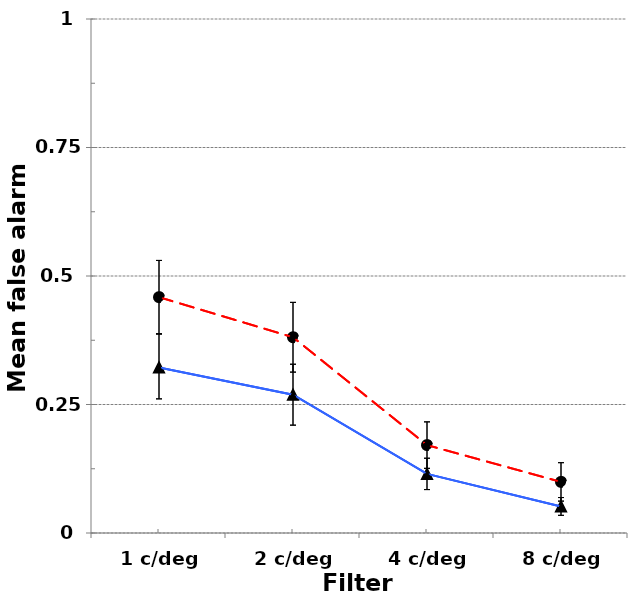
| Category | Low Unusual Experiences score | High Unusual Experiences score |
|---|---|---|
| 1 c/deg | 0.322 | 0.459 |
| 2 c/deg | 0.269 | 0.381 |
| 4 c/deg | 0.115 | 0.171 |
| 8 c/deg | 0.052 | 0.099 |